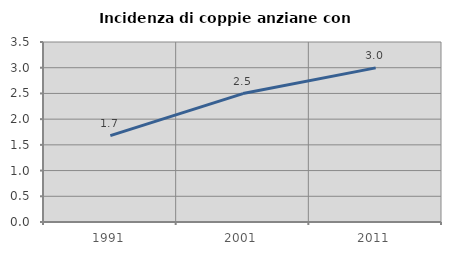
| Category | Incidenza di coppie anziane con figli |
|---|---|
| 1991.0 | 1.681 |
| 2001.0 | 2.497 |
| 2011.0 | 2.997 |